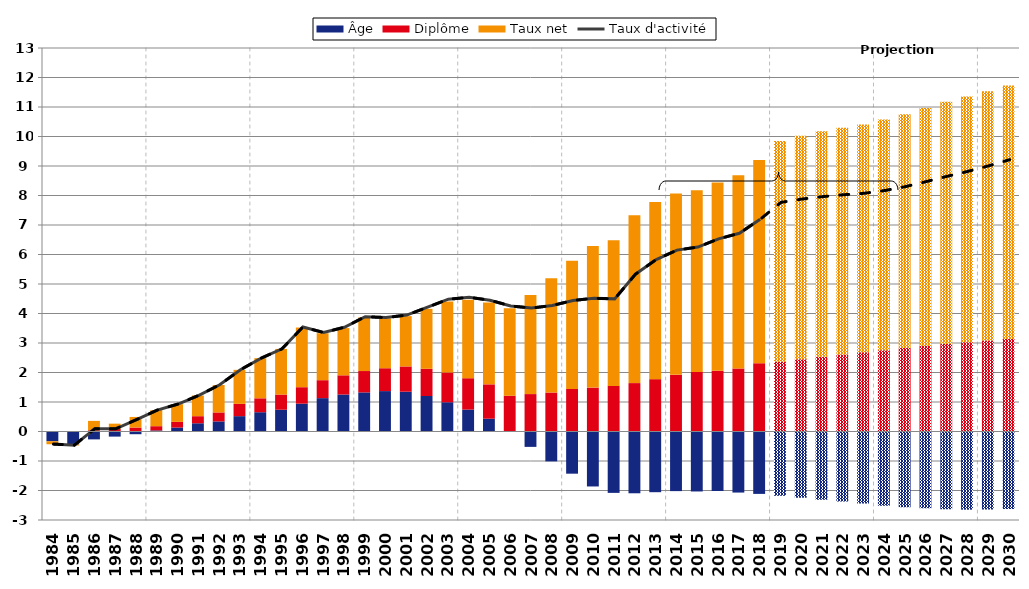
| Category | Âge | Diplôme | Taux net |
|---|---|---|---|
| 1984.0 | -0.33 | 0.012 | -0.102 |
| 1985.0 | -0.442 | 0.014 | -0.032 |
| 1986.0 | -0.267 | 0.043 | 0.318 |
| 1987.0 | -0.173 | 0.086 | 0.18 |
| 1988.0 | -0.092 | 0.134 | 0.36 |
| 1989.0 | 0.036 | 0.144 | 0.547 |
| 1990.0 | 0.134 | 0.192 | 0.599 |
| 1991.0 | 0.279 | 0.24 | 0.701 |
| 1992.0 | 0.342 | 0.305 | 0.929 |
| 1993.0 | 0.52 | 0.416 | 1.153 |
| 1994.0 | 0.654 | 0.472 | 1.361 |
| 1995.0 | 0.738 | 0.514 | 1.547 |
| 1996.0 | 0.944 | 0.557 | 2.023 |
| 1997.0 | 1.131 | 0.608 | 1.593 |
| 1998.0 | 1.254 | 0.651 | 1.601 |
| 1999.0 | 1.325 | 0.724 | 1.816 |
| 2000.0 | 1.37 | 0.775 | 1.688 |
| 2001.0 | 1.349 | 0.856 | 1.705 |
| 2002.0 | 1.203 | 0.923 | 2.033 |
| 2003.0 | 0.991 | 1.007 | 2.41 |
| 2004.0 | 0.743 | 1.064 | 2.66 |
| 2005.0 | 0.435 | 1.163 | 2.774 |
| 2006.0 | 0.003 | 1.21 | 2.964 |
| 2007.0 | -0.521 | 1.267 | 3.357 |
| 2008.0 | -1.013 | 1.321 | 3.877 |
| 2009.0 | -1.43 | 1.441 | 4.343 |
| 2010.0 | -1.863 | 1.488 | 4.802 |
| 2011.0 | -2.081 | 1.546 | 4.937 |
| 2012.0 | -2.094 | 1.64 | 5.686 |
| 2013.0 | -2.058 | 1.775 | 6.008 |
| 2014.0 | -2.021 | 1.92 | 6.151 |
| 2015.0 | -2.033 | 2.019 | 6.162 |
| 2016.0 | -2.017 | 2.059 | 6.385 |
| 2017.0 | -2.07 | 2.137 | 6.547 |
| 2018.0 | -2.115 | 2.314 | 6.892 |
| 2019.0 | -2.18 | 2.367 | 7.482 |
| 2020.0 | -2.249 | 2.452 | 7.575 |
| 2021.0 | -2.316 | 2.534 | 7.641 |
| 2022.0 | -2.374 | 2.61 | 7.685 |
| 2023.0 | -2.441 | 2.684 | 7.725 |
| 2024.0 | -2.513 | 2.758 | 7.815 |
| 2025.0 | -2.565 | 2.83 | 7.926 |
| 2026.0 | -2.604 | 2.899 | 8.065 |
| 2027.0 | -2.637 | 2.965 | 8.209 |
| 2028.0 | -2.65 | 3.026 | 8.329 |
| 2029.0 | -2.641 | 3.083 | 8.452 |
| 2030.0 | -2.626 | 3.135 | 8.591 |